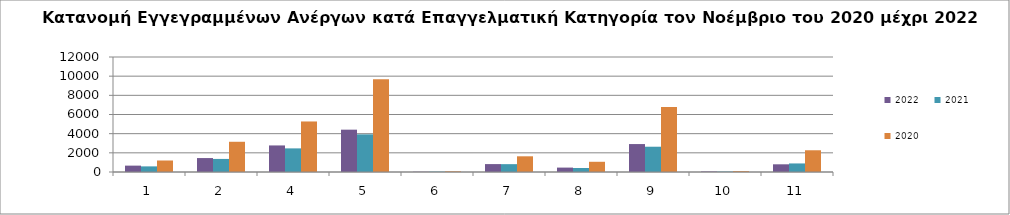
| Category | 2022 | 2021 | 2020 |
|---|---|---|---|
| 1.0 | 665 | 587 | 1200 |
| 2.0 | 1455 | 1364 | 3154 |
| 4.0 | 2772 | 2465 | 5273 |
| 5.0 | 4417 | 3927 | 9667 |
| 6.0 | 25 | 36 | 70 |
| 7.0 | 826 | 819 | 1638 |
| 8.0 | 460 | 419 | 1066 |
| 9.0 | 2916 | 2638 | 6779 |
| 10.0 | 54 | 42 | 92 |
| 11.0 | 803 | 893 | 2268 |